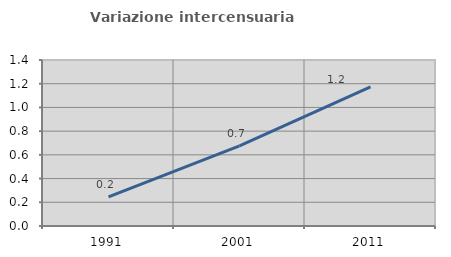
| Category | Variazione intercensuaria annua |
|---|---|
| 1991.0 | 0.246 |
| 2001.0 | 0.676 |
| 2011.0 | 1.173 |